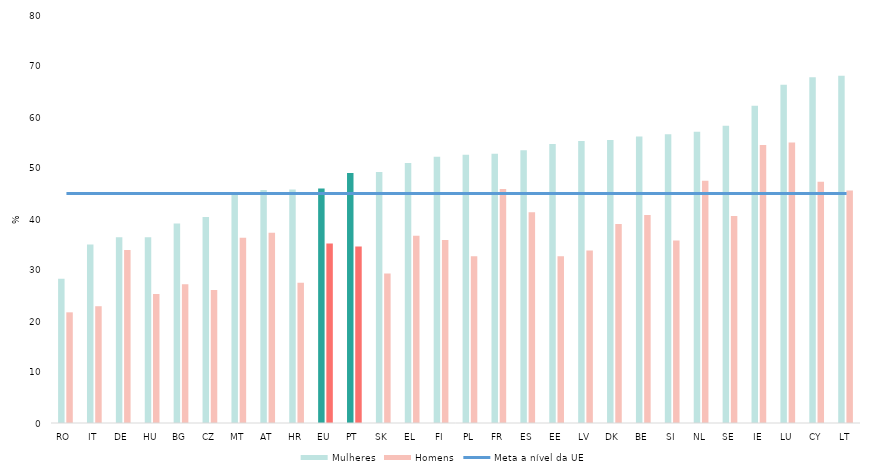
| Category | Mulheres | Homens |
|---|---|---|
| RO | 28.3 | 21.7 |
| IT | 35 | 22.9 |
| DE | 36.4 | 33.9 |
| HU | 36.4 | 25.3 |
| BG | 39.1 | 27.2 |
| CZ | 40.4 | 26.1 |
| MT | 44.7 | 36.3 |
| AT | 45.7 | 37.3 |
| HR | 45.8 | 27.5 |
| EU | 46 | 35.2 |
| PT | 49 | 34.6 |
| SK | 49.2 | 29.3 |
| EL | 51 | 36.7 |
| FI | 52.2 | 35.9 |
| PL | 52.6 | 32.7 |
| FR | 52.8 | 45.9 |
| ES | 53.5 | 41.3 |
| EE | 54.7 | 32.7 |
| LV | 55.3 | 33.8 |
| DK | 55.5 | 39 |
| BE | 56.2 | 40.8 |
| SI | 56.6 | 35.8 |
| NL | 57.1 | 47.5 |
| SE | 58.3 | 40.6 |
| IE | 62.2 | 54.5 |
| LU | 66.3 | 55 |
| CY | 67.8 | 47.3 |
| LT | 68.1 | 45.6 |